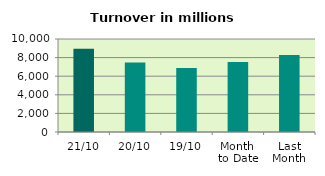
| Category | Series 0 |
|---|---|
| 21/10 | 8960.29 |
| 20/10 | 7469.415 |
| 19/10 | 6890.805 |
| Month 
to Date | 7538.136 |
| Last
Month | 8284.199 |